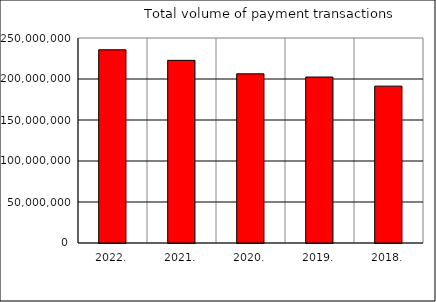
| Category | Total volume of payment transactions |
|---|---|
| 2022. | 235647669 |
| 2021. | 222739691 |
| 2020. | 206334436 |
| 2019. | 202391763 |
| 2018. | 191309343 |